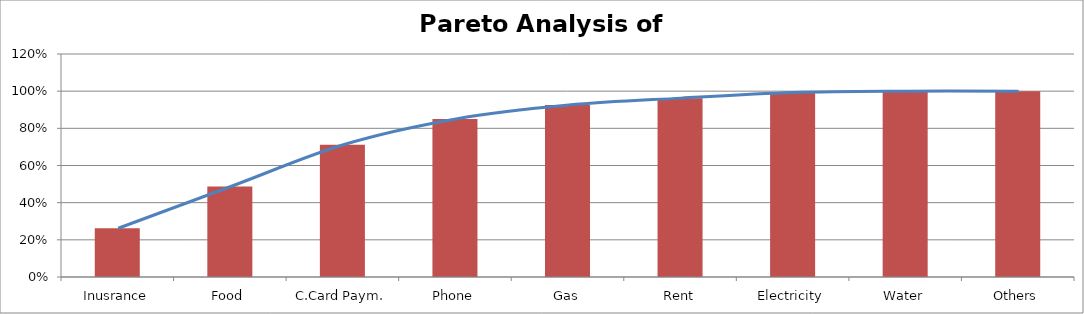
| Category | Series 1 |
|---|---|
| 0 | 0.262 |
| 1 | 0.487 |
| 2 | 0.712 |
| 3 | 0.85 |
| 4 | 0.925 |
| 5 | 0.963 |
| 6 | 0.993 |
| 7 | 1 |
| 8 | 1 |